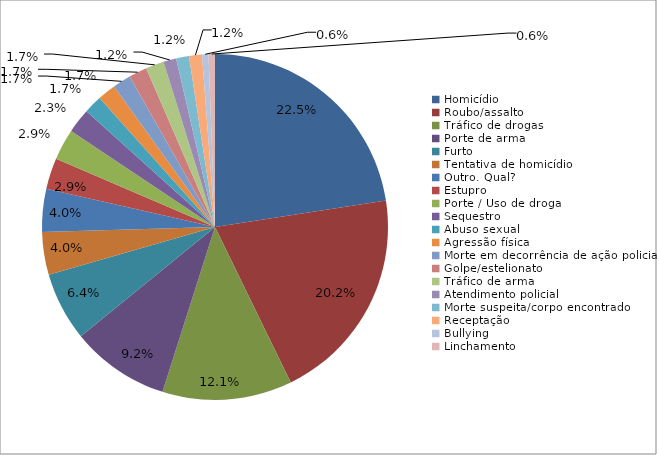
| Category | Series 0 |
|---|---|
| Homicídio | 0.225 |
| Roubo/assalto | 0.202 |
| Tráfico de drogas | 0.121 |
| Porte de arma | 0.092 |
| Furto | 0.064 |
| Tentativa de homicídio | 0.04 |
| Outro. Qual? | 0.04 |
| Estupro | 0.029 |
| Porte / Uso de droga | 0.029 |
| Sequestro | 0.023 |
| Abuso sexual | 0.017 |
| Agressão física | 0.017 |
| Morte em decorrência de ação policial | 0.017 |
| Golpe/estelionato | 0.017 |
| Tráfico de arma | 0.017 |
| Atendimento policial | 0.012 |
| Morte suspeita/corpo encontrado | 0.012 |
| Receptação | 0.012 |
| Bullying | 0.006 |
| Linchamento | 0.006 |